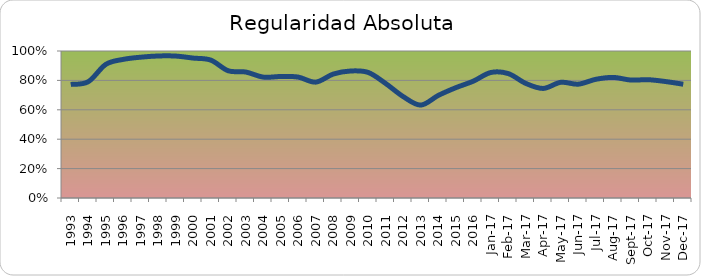
| Category | Series 0 |
|---|---|
| 1993.0 | 0.773 |
| 1994.0 | 0.791 |
| 1995.0 | 0.909 |
| 1996.0 | 0.943 |
| 1997.0 | 0.958 |
| 1998.0 | 0.966 |
| 1999.0 | 0.966 |
| 2000.0 | 0.952 |
| 2001.0 | 0.938 |
| 2002.0 | 0.865 |
| 2003.0 | 0.857 |
| 2004.0 | 0.822 |
| 2005.0 | 0.827 |
| 2006.0 | 0.822 |
| 2007.0 | 0.788 |
| 2008.0 | 0.843 |
| 2009.0 | 0.864 |
| 2010.0 | 0.854 |
| 2011.0 | 0.779 |
| 2012.0 | 0.69 |
| 2013.0 | 0.632 |
| 2014.0 | 0.698 |
| 2015.0 | 0.75 |
| 2016.0 | 0.795 |
| 42736.0 | 0.854 |
| 42767.0 | 0.846 |
| 42795.0 | 0.78 |
| 42826.0 | 0.745 |
| 42856.0 | 0.787 |
| 42887.0 | 0.774 |
| 42917.0 | 0.807 |
| 42948.0 | 0.82 |
| 42979.0 | 0.802 |
| 43009.0 | 0.805 |
| 43040.0 | 0.792 |
| 43070.0 | 0.774 |